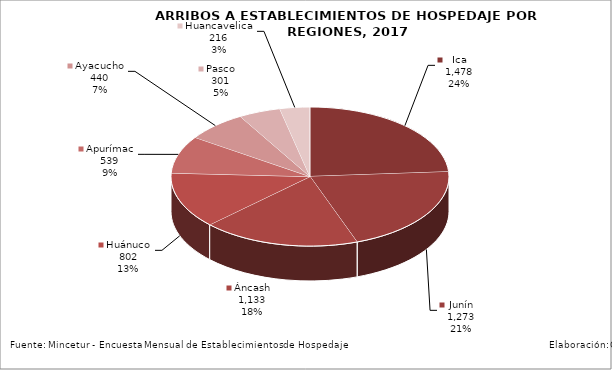
| Category | Series 0 |
|---|---|
| Ica | 1477.841 |
| Junín | 1272.902 |
| Áncash | 1132.509 |
| Huánuco | 802.072 |
| Apurímac | 538.819 |
| Ayacucho | 439.545 |
| Pasco | 301.369 |
| Huancavelica | 215.867 |